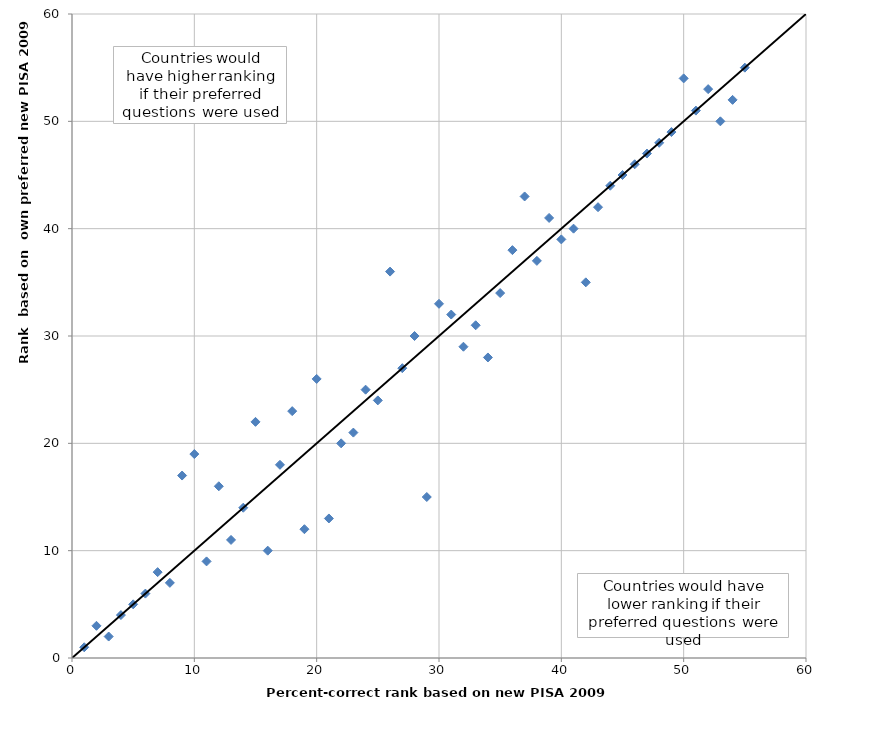
| Category | Series 0 |
|---|---|
| 60.0 | 60 |
| 0.0 | 0 |
| 1.0 | 1 |
| 2.0 | 3 |
| 3.0 | 2 |
| 4.0 | 4 |
| 5.0 | 5 |
| 6.0 | 6 |
| 7.0 | 8 |
| 8.0 | 7 |
| 9.0 | 17 |
| 10.0 | 19 |
| 11.0 | 9 |
| 12.0 | 16 |
| 13.0 | 11 |
| 14.0 | 14 |
| 15.0 | 22 |
| 16.0 | 10 |
| 17.0 | 18 |
| 18.0 | 23 |
| 19.0 | 12 |
| 20.0 | 26 |
| 21.0 | 13 |
| 22.0 | 20 |
| 23.0 | 21 |
| 24.0 | 25 |
| 25.0 | 24 |
| 26.0 | 36 |
| 27.0 | 27 |
| 28.0 | 30 |
| 29.0 | 15 |
| 30.0 | 33 |
| 31.0 | 32 |
| 32.0 | 29 |
| 33.0 | 31 |
| 34.0 | 28 |
| 35.0 | 34 |
| 36.0 | 38 |
| 37.0 | 43 |
| 38.0 | 37 |
| 39.0 | 41 |
| 40.0 | 39 |
| 41.0 | 40 |
| 42.0 | 35 |
| 43.0 | 42 |
| 44.0 | 44 |
| 45.0 | 45 |
| 46.0 | 46 |
| 47.0 | 47 |
| 48.0 | 48 |
| 49.0 | 49 |
| 50.0 | 54 |
| 51.0 | 51 |
| 52.0 | 53 |
| 53.0 | 50 |
| 54.0 | 52 |
| 55.0 | 55 |